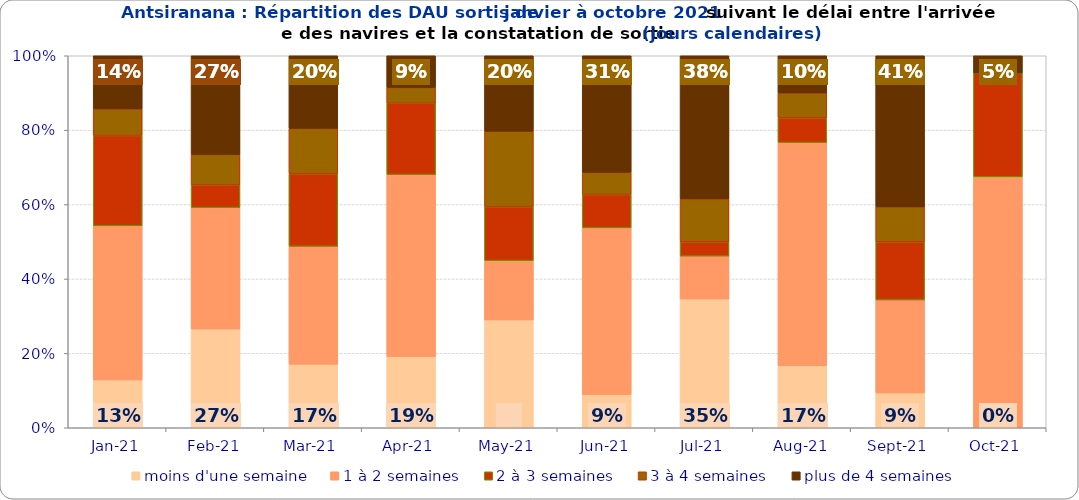
| Category | moins d'une semaine | 1 à 2 semaines | 2 à 3 semaines | 3 à 4 semaines | plus de 4 semaines |
|---|---|---|---|---|---|
| 2021-01-01 | 0.129 | 0.414 | 0.243 | 0.071 | 0.143 |
| 2021-02-01 | 0.265 | 0.327 | 0.061 | 0.082 | 0.265 |
| 2021-03-01 | 0.171 | 0.317 | 0.195 | 0.122 | 0.195 |
| 2021-04-01 | 0.191 | 0.489 | 0.191 | 0.043 | 0.085 |
| 2021-05-01 | 0.29 | 0.159 | 0.145 | 0.203 | 0.203 |
| 2021-06-01 | 0.09 | 0.448 | 0.09 | 0.06 | 0.313 |
| 2021-07-01 | 0.346 | 0.115 | 0.038 | 0.115 | 0.385 |
| 2021-08-01 | 0.167 | 0.6 | 0.067 | 0.067 | 0.1 |
| 2021-09-01 | 0.094 | 0.25 | 0.156 | 0.094 | 0.406 |
| 2021-10-01 | 0 | 0.674 | 0.279 | 0 | 0.047 |